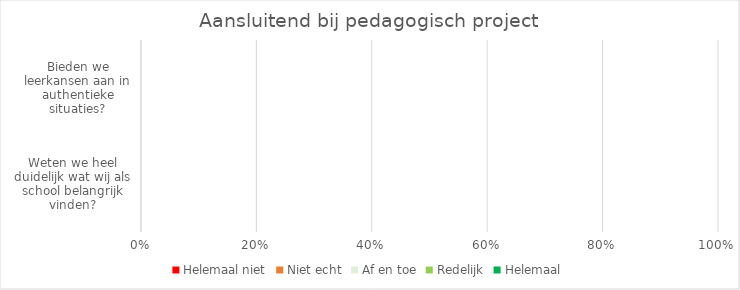
| Category | Helemaal niet | Niet echt | Af en toe | Redelijk | Helemaal |
|---|---|---|---|---|---|
| Weten we heel duidelijk wat wij als school belangrijk vinden? | 0 | 0 | 0 | 0 | 0 |
| Bieden we leerkansen aan in authentieke situaties? | 0 | 0 | 0 | 0 | 0 |